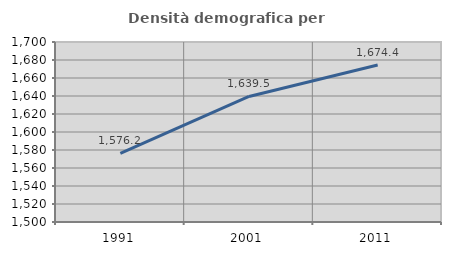
| Category | Densità demografica |
|---|---|
| 1991.0 | 1576.212 |
| 2001.0 | 1639.496 |
| 2011.0 | 1674.43 |